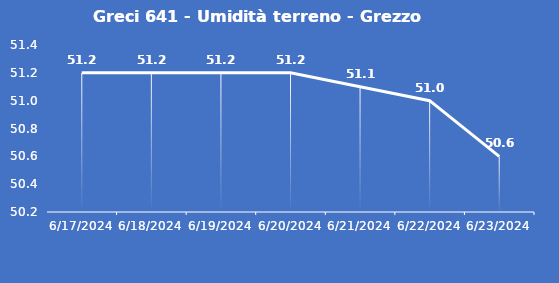
| Category | Greci 641 - Umidità terreno - Grezzo (%VWC) |
|---|---|
| 6/17/24 | 51.2 |
| 6/18/24 | 51.2 |
| 6/19/24 | 51.2 |
| 6/20/24 | 51.2 |
| 6/21/24 | 51.1 |
| 6/22/24 | 51 |
| 6/23/24 | 50.6 |